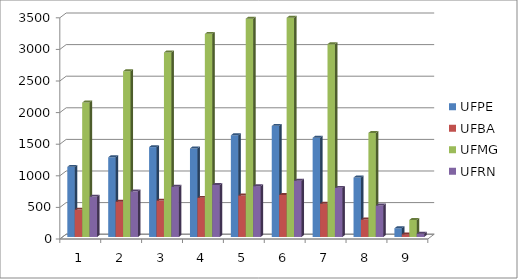
| Category | UFPE | UFBA | UFMG | UFRN |
|---|---|---|---|---|
| 0 | 1110 | 433 | 2127 | 639 |
| 1 | 1261 | 559 | 2622 | 722 |
| 2 | 1422 | 576 | 2920 | 794 |
| 3 | 1401 | 619 | 3214 | 824 |
| 4 | 1609 | 656 | 3454 | 804 |
| 5 | 1758 | 665 | 3469 | 890 |
| 6 | 1570 | 527 | 3051 | 777 |
| 7 | 941 | 276 | 1646 | 498 |
| 8 | 138 | 42 | 269 | 52 |